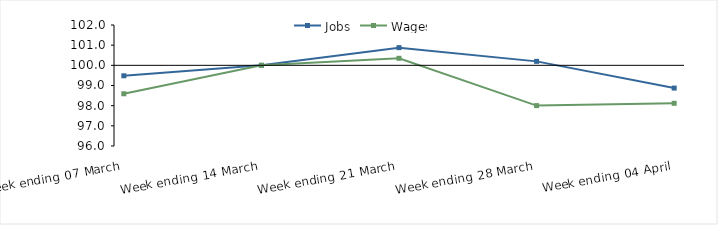
| Category | Jobs | Wages |
|---|---|---|
| 0 | 99.481 | 98.59 |
| 1900-01-01 | 100 | 100 |
| 1900-01-02 | 100.877 | 100.349 |
| 1900-01-03 | 100.197 | 98.003 |
| 1900-01-04 | 98.872 | 98.117 |